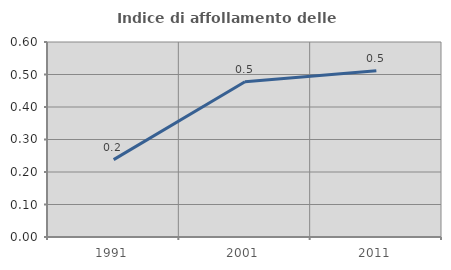
| Category | Indice di affollamento delle abitazioni  |
|---|---|
| 1991.0 | 0.238 |
| 2001.0 | 0.478 |
| 2011.0 | 0.511 |